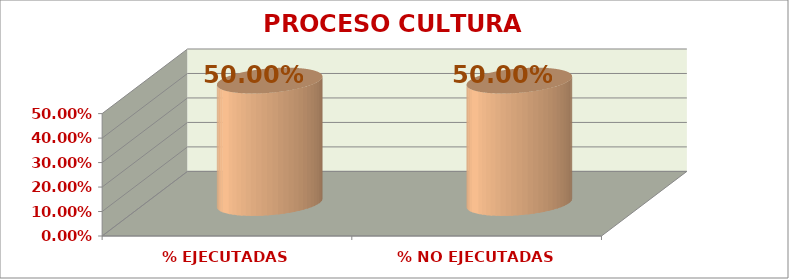
| Category | PROCESO CULTURA INSTITUCIONAL |
|---|---|
| % EJECUTADAS | 0.5 |
| % NO EJECUTADAS | 0.5 |